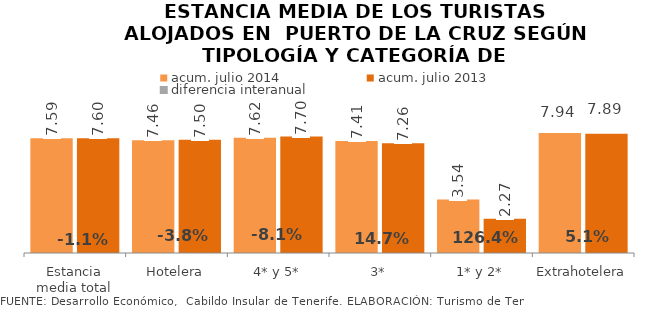
| Category | acum. julio 2014 | acum. julio 2013 |
|---|---|---|
| Estancia media total | 7.587 | 7.598 |
| Hotelera | 7.458 | 7.497 |
| 4* y 5* | 7.622 | 7.703 |
| 3* | 7.412 | 7.264 |
| 1* y 2* | 3.535 | 2.271 |
| Extrahotelera | 7.938 | 7.887 |